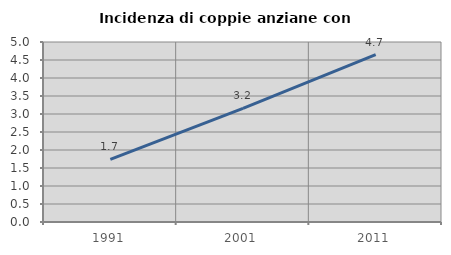
| Category | Incidenza di coppie anziane con figli |
|---|---|
| 1991.0 | 1.739 |
| 2001.0 | 3.159 |
| 2011.0 | 4.651 |